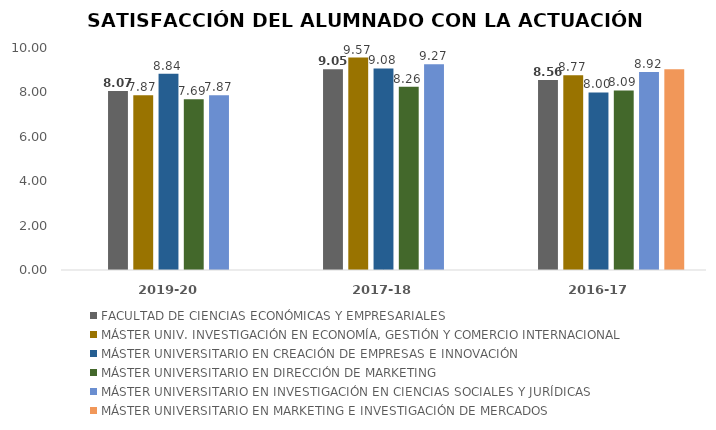
| Category | Series 7 | FACULTAD DE CIENCIAS ECONÓMICAS Y EMPRESARIALES | MÁSTER UNIV. INVESTIGACIÓN EN ECONOMÍA, GESTIÓN Y COMERCIO INTERNACIONAL | MÁSTER UNIVERSITARIO EN CREACIÓN DE EMPRESAS E INNOVACIÓN | MÁSTER UNIVERSITARIO EN DIRECCIÓN DE MARKETING | MÁSTER UNIVERSITARIO EN INVESTIGACIÓN EN CIENCIAS SOCIALES Y JURÍDICAS | MÁSTER UNIVERSITARIO EN MARKETING E INVESTIGACIÓN DE MERCADOS |
|---|---|---|---|---|---|---|---|
| 2019-20 |  | 8.068 | 7.87 | 8.84 | 7.69 | 7.87 | 0 |
| 2017-18 |  | 9.045 | 9.57 | 9.08 | 8.26 | 9.27 | 0 |
| 2016-17 |  | 8.564 | 8.77 | 8 | 8.09 | 8.92 | 9.04 |